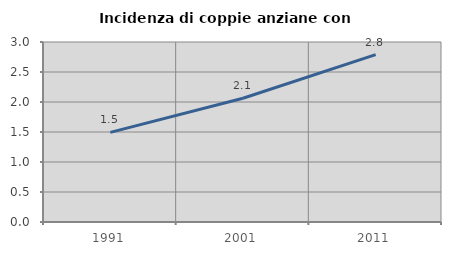
| Category | Incidenza di coppie anziane con figli |
|---|---|
| 1991.0 | 1.493 |
| 2001.0 | 2.063 |
| 2011.0 | 2.789 |